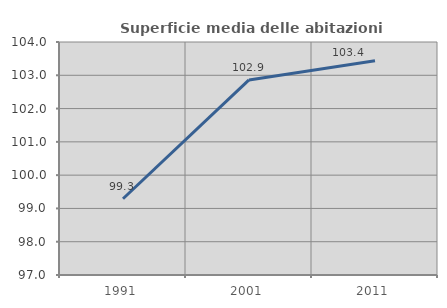
| Category | Superficie media delle abitazioni occupate |
|---|---|
| 1991.0 | 99.291 |
| 2001.0 | 102.861 |
| 2011.0 | 103.435 |